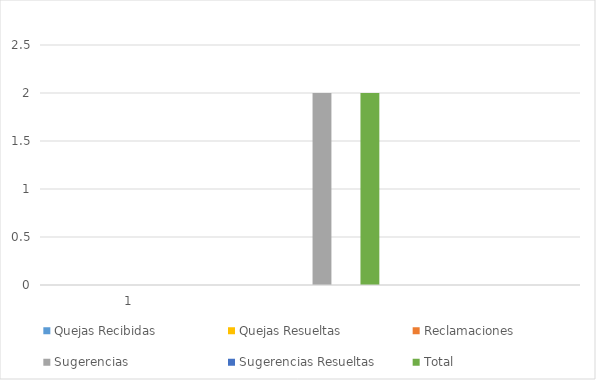
| Category | Quejas Recibidas | Quejas Resueltas | Reclamaciones | Sugerencias | Sugerencias Resueltas | Total |
|---|---|---|---|---|---|---|
| 1.0 | 0 | 0 | 0 | 0 | 0 | 0 |